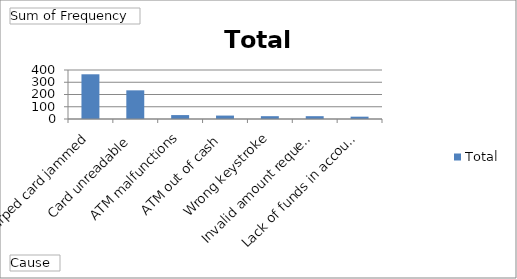
| Category | Total |
|---|---|
| Warped card jammed | 365 |
| Card unreadable | 234 |
| ATM malfunctions | 32 |
| ATM out of cash | 28 |
| Wrong keystroke | 23 |
| Invalid amount requested | 23 |
| Lack of funds in account | 19 |